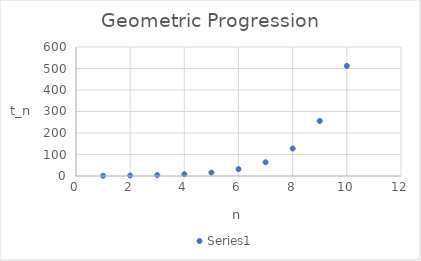
| Category | Series 0 |
|---|---|
| 1.0 | 1 |
| 2.0 | 2 |
| 3.0 | 4 |
| 4.0 | 8 |
| 5.0 | 16 |
| 6.0 | 32 |
| 7.0 | 64 |
| 8.0 | 128 |
| 9.0 | 256 |
| 10.0 | 512 |